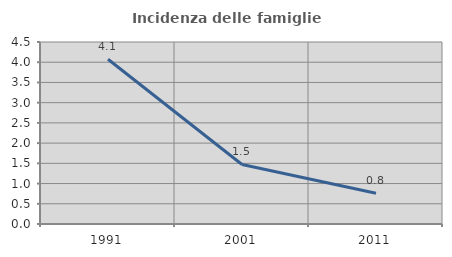
| Category | Incidenza delle famiglie numerose |
|---|---|
| 1991.0 | 4.072 |
| 2001.0 | 1.472 |
| 2011.0 | 0.762 |